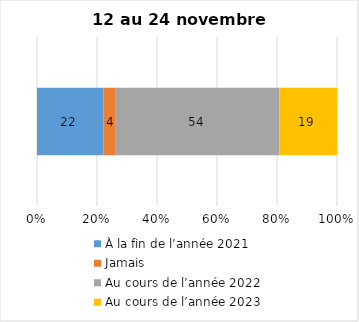
| Category | À la fin de l’année 2021 | Jamais | Au cours de l’année 2022 | Au cours de l’année 2023 |
|---|---|---|---|---|
| 0 | 22 | 4 | 54 | 19 |